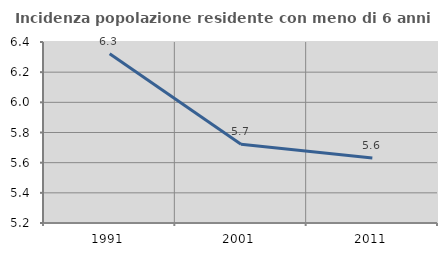
| Category | Incidenza popolazione residente con meno di 6 anni |
|---|---|
| 1991.0 | 6.322 |
| 2001.0 | 5.722 |
| 2011.0 | 5.63 |